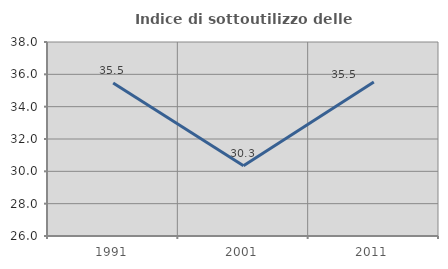
| Category | Indice di sottoutilizzo delle abitazioni  |
|---|---|
| 1991.0 | 35.465 |
| 2001.0 | 30.348 |
| 2011.0 | 35.526 |